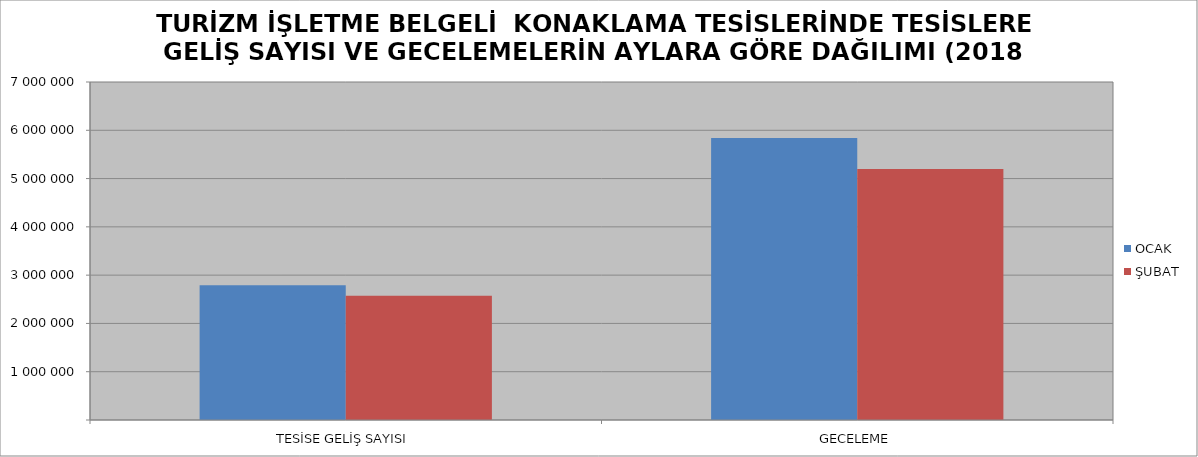
| Category | OCAK | ŞUBAT |
|---|---|---|
| TESİSE GELİŞ SAYISI | 2792196 | 2573999 |
| GECELEME | 5837753 | 5199578 |